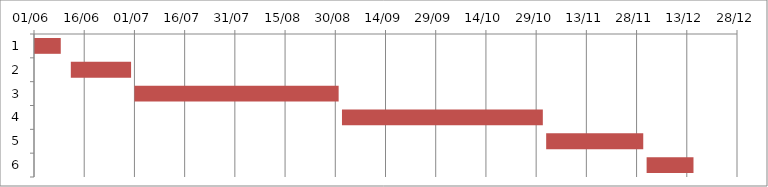
| Category | Fecha de inicio | DURACIÓN |
|---|---|---|
| 0 | 6/1/17 | 8 |
| 1 | 6/12/17 | 18 |
| 2 | 7/1/17 | 61 |
| 3 | 9/1/17 | 60 |
| 4 | 11/1/17 | 29 |
| 5 | 12/1/17 | 14 |